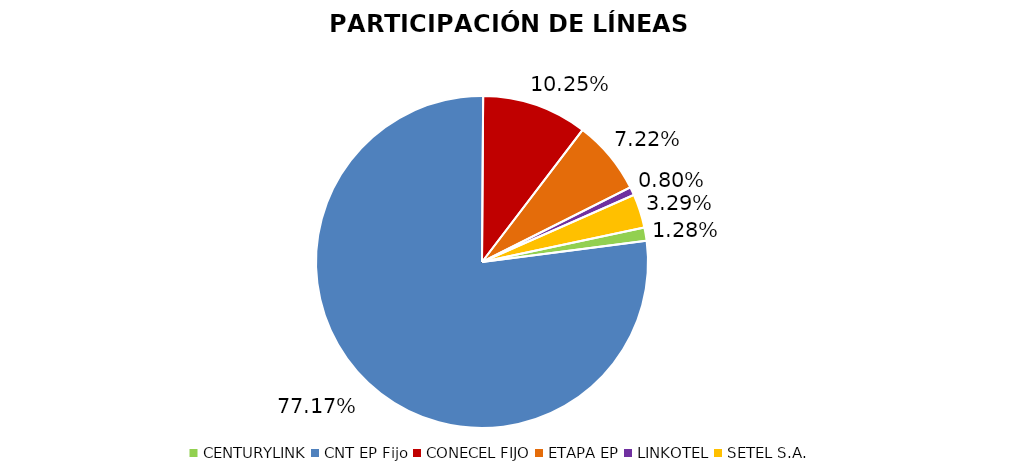
| Category | Participación en el Mercado |
|---|---|
| CENTURYLINK | 0.013 |
| CNT EP Fijo | 0.772 |
| CONECEL FIJO | 0.102 |
| ETAPA EP | 0.072 |
| LINKOTEL | 0.008 |
| SETEL S.A. | 0.033 |